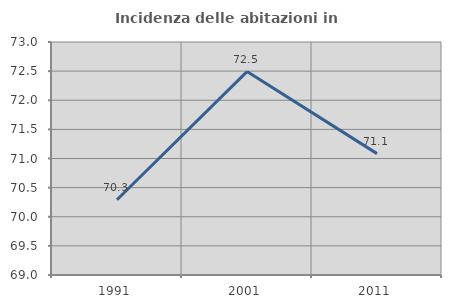
| Category | Incidenza delle abitazioni in proprietà  |
|---|---|
| 1991.0 | 70.292 |
| 2001.0 | 72.492 |
| 2011.0 | 71.084 |